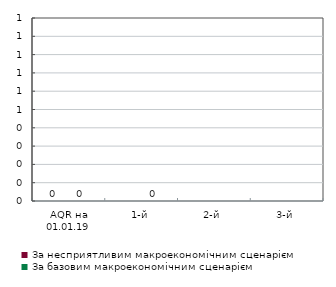
| Category | За несприятливим макроекономічним сценарієм | За базовим макроекономічним сценарієм |
|---|---|---|
| AQR на 01.01.19 | 0 | 0 |
| 1-й | 0 | 0 |
| 2-й | 0 | 0 |
| 3-й | 0 | 0 |